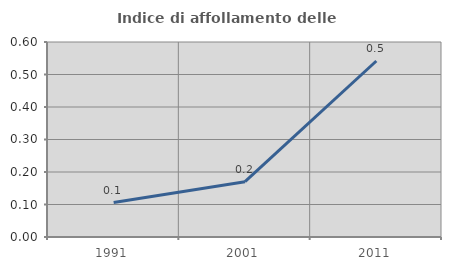
| Category | Indice di affollamento delle abitazioni  |
|---|---|
| 1991.0 | 0.106 |
| 2001.0 | 0.17 |
| 2011.0 | 0.542 |